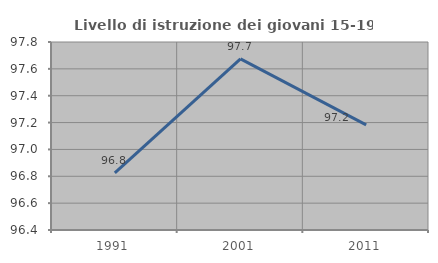
| Category | Livello di istruzione dei giovani 15-19 anni |
|---|---|
| 1991.0 | 96.825 |
| 2001.0 | 97.674 |
| 2011.0 | 97.183 |